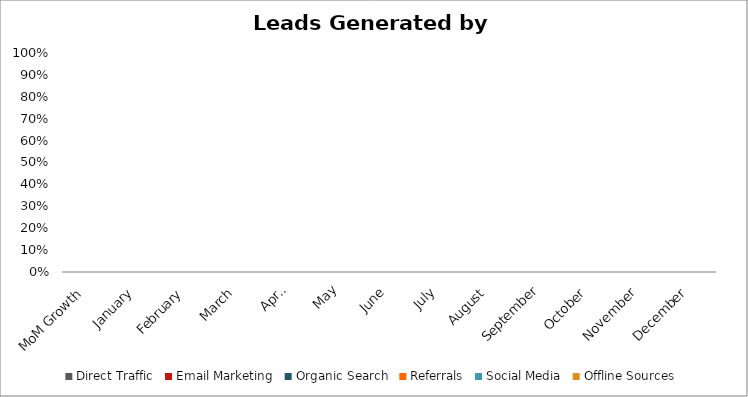
| Category | Direct Traffic | Email Marketing | Organic Search | Referrals | Social Media | Offline Sources |
|---|---|---|---|---|---|---|
| MoM Growth | 0 | 0 | 0 | 0 | 0 | 0 |
| January | 0 | 0 | 0 | 0 | 0 | 0 |
| February | 0 | 0 | 0 | 0 | 0 | 0 |
| March | 0 | 0 | 0 | 0 | 0 | 0 |
| April | 0 | 0 | 0 | 0 | 0 | 0 |
| May | 0 | 0 | 0 | 0 | 0 | 0 |
| June | 0 | 0 | 0 | 0 | 0 | 0 |
| July | 0 | 0 | 0 | 0 | 0 | 0 |
| August | 0 | 0 | 0 | 0 | 0 | 0 |
| September | 0 | 0 | 0 | 0 | 0 | 0 |
| October | 0 | 0 | 0 | 0 | 0 | 0 |
| November | 0 | 0 | 0 | 0 | 0 | 0 |
| December | 0 | 0 | 0 | 0 | 0 | 0 |